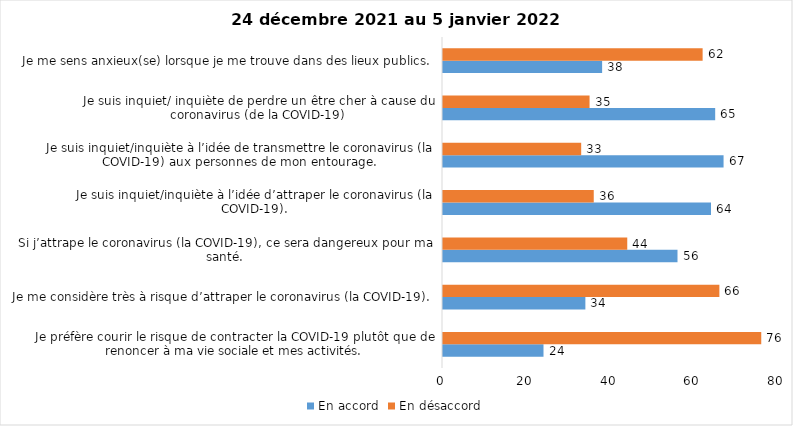
| Category | En accord | En désaccord |
|---|---|---|
| Je préfère courir le risque de contracter la COVID-19 plutôt que de renoncer à ma vie sociale et mes activités. | 24 | 76 |
| Je me considère très à risque d’attraper le coronavirus (la COVID-19). | 34 | 66 |
| Si j’attrape le coronavirus (la COVID-19), ce sera dangereux pour ma santé. | 56 | 44 |
| Je suis inquiet/inquiète à l’idée d’attraper le coronavirus (la COVID-19). | 64 | 36 |
| Je suis inquiet/inquiète à l’idée de transmettre le coronavirus (la COVID-19) aux personnes de mon entourage. | 67 | 33 |
| Je suis inquiet/ inquiète de perdre un être cher à cause du coronavirus (de la COVID-19) | 65 | 35 |
| Je me sens anxieux(se) lorsque je me trouve dans des lieux publics. | 38 | 62 |